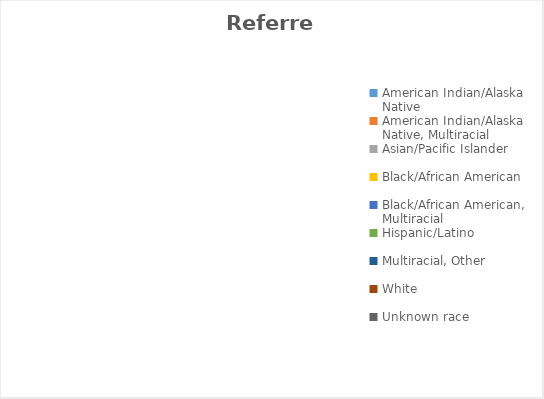
| Category | Referred |
|---|---|
| American Indian/Alaska Native  | 0 |
| American Indian/Alaska Native, Multiracial | 0 |
| Asian/Pacific Islander | 0 |
| Black/African American | 0 |
| Black/African American, Multiracial | 0 |
| Hispanic/Latino  | 0 |
| Multiracial, Other | 0 |
| White  | 0 |
| Unknown race | 0 |